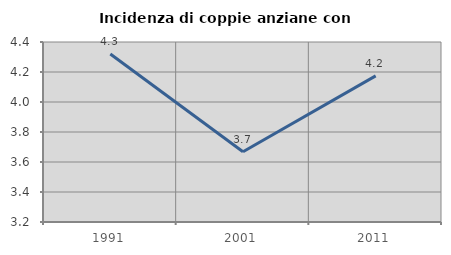
| Category | Incidenza di coppie anziane con figli |
|---|---|
| 1991.0 | 4.32 |
| 2001.0 | 3.668 |
| 2011.0 | 4.174 |